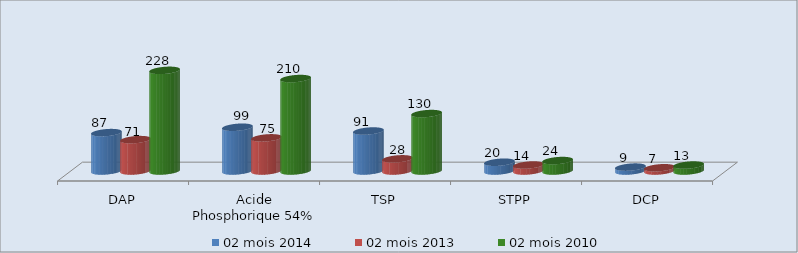
| Category | 02 mois 2014 | 02 mois 2013 | 02 mois 2010 |
|---|---|---|---|
| DAP | 87.094 | 71.179 | 228.4 |
| Acide Phosphorique 54% | 99.301 | 75.196 | 209.762 |
| TSP | 90.72 | 27.555 | 130.309 |
| STPP | 19.928 | 13.604 | 23.675 |
| DCP | 8.82 | 7.34 | 13.49 |